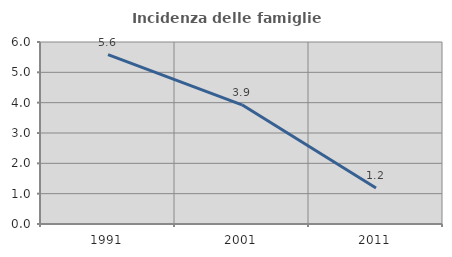
| Category | Incidenza delle famiglie numerose |
|---|---|
| 1991.0 | 5.582 |
| 2001.0 | 3.93 |
| 2011.0 | 1.186 |